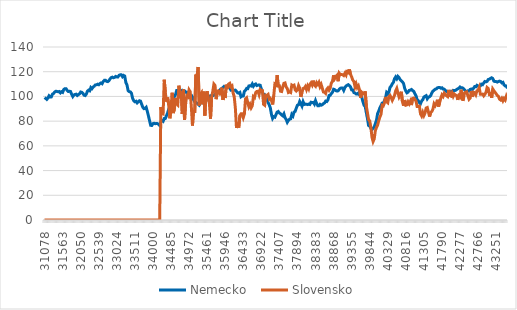
| Category | Nemecko  | Slovensko |
|---|---|---|
| 31078.0 | 99.1 | 0 |
| 31106.0 | 98.4 | 0 |
| 31137.0 | 97.6 | 0 |
| 31167.0 | 98.7 | 0 |
| 31198.0 | 100.5 | 0 |
| 31228.0 | 99.5 | 0 |
| 31259.0 | 99.6 | 0 |
| 31290.0 | 101.9 | 0 |
| 31320.0 | 102.4 | 0 |
| 31351.0 | 103.6 | 0 |
| 31381.0 | 104.2 | 0 |
| 31412.0 | 104 | 0 |
| 31443.0 | 103.8 | 0 |
| 31471.0 | 104 | 0 |
| 31502.0 | 102.9 | 0 |
| 31532.0 | 103.8 | 0 |
| 31563.0 | 103.3 | 0 |
| 31593.0 | 105.6 | 0 |
| 31624.0 | 106.3 | 0 |
| 31655.0 | 106.3 | 0 |
| 31685.0 | 104.9 | 0 |
| 31716.0 | 104 | 0 |
| 31746.0 | 104.2 | 0 |
| 31777.0 | 104 | 0 |
| 31808.0 | 101.7 | 0 |
| 31836.0 | 99.9 | 0 |
| 31867.0 | 101.2 | 0 |
| 31897.0 | 101.6 | 0 |
| 31928.0 | 101.8 | 0 |
| 31958.0 | 100.8 | 0 |
| 31989.0 | 101.5 | 0 |
| 32020.0 | 102.1 | 0 |
| 32050.0 | 103.6 | 0 |
| 32081.0 | 103.3 | 0 |
| 32111.0 | 102.5 | 0 |
| 32142.0 | 101 | 0 |
| 32173.0 | 100.7 | 0 |
| 32202.0 | 101.9 | 0 |
| 32233.0 | 104.3 | 0 |
| 32263.0 | 105.1 | 0 |
| 32294.0 | 104.6 | 0 |
| 32324.0 | 107.2 | 0 |
| 32355.0 | 106.3 | 0 |
| 32386.0 | 107.5 | 0 |
| 32416.0 | 108.3 | 0 |
| 32447.0 | 109.3 | 0 |
| 32477.0 | 109.4 | 0 |
| 32508.0 | 109.9 | 0 |
| 32539.0 | 109.5 | 0 |
| 32567.0 | 110.4 | 0 |
| 32598.0 | 110.9 | 0 |
| 32628.0 | 110.3 | 0 |
| 32659.0 | 112.1 | 0 |
| 32689.0 | 113.1 | 0 |
| 32720.0 | 113.1 | 0 |
| 32751.0 | 112.2 | 0 |
| 32781.0 | 112 | 0 |
| 32812.0 | 112.7 | 0 |
| 32842.0 | 114.2 | 0 |
| 32873.0 | 115.2 | 0 |
| 32904.0 | 115.6 | 0 |
| 32932.0 | 115.1 | 0 |
| 32963.0 | 115.4 | 0 |
| 32993.0 | 116.2 | 0 |
| 33024.0 | 115.8 | 0 |
| 33054.0 | 115.8 | 0 |
| 33085.0 | 117.1 | 0 |
| 33116.0 | 117.5 | 0 |
| 33146.0 | 117.5 | 0 |
| 33177.0 | 116 | 0 |
| 33207.0 | 117 | 0 |
| 33238.0 | 116.5 | 0 |
| 33269.0 | 111.3 | 0 |
| 33297.0 | 109.3 | 0 |
| 33328.0 | 104.7 | 0 |
| 33358.0 | 103.9 | 0 |
| 33389.0 | 103.7 | 0 |
| 33419.0 | 102.5 | 0 |
| 33450.0 | 98.4 | 0 |
| 33481.0 | 96.5 | 0 |
| 33511.0 | 95.7 | 0 |
| 33542.0 | 96.1 | 0 |
| 33572.0 | 94.8 | 0 |
| 33603.0 | 95.7 | 0 |
| 33634.0 | 96.5 | 0 |
| 33663.0 | 96.2 | 0 |
| 33694.0 | 93.7 | 0 |
| 33724.0 | 91.3 | 0 |
| 33755.0 | 90.1 | 0 |
| 33785.0 | 90.3 | 0 |
| 33816.0 | 91.2 | 0 |
| 33847.0 | 87.9 | 0 |
| 33877.0 | 84.3 | 0 |
| 33908.0 | 80.4 | 0 |
| 33938.0 | 76.6 | 0 |
| 33969.0 | 76.5 | 0 |
| 34000.0 | 78 | 0 |
| 34028.0 | 78.3 | 0 |
| 34059.0 | 77.9 | 0 |
| 34089.0 | 78.1 | 0 |
| 34120.0 | 78 | 0 |
| 34150.0 | 77.4 | 0 |
| 34181.0 | 76.4 | 0 |
| 34212.0 | 79.6 | 91.4 |
| 34242.0 | 80.4 | 86.1 |
| 34273.0 | 79.8 | 85.8 |
| 34303.0 | 82.1 | 113.5 |
| 34334.0 | 82.2 | 103.1 |
| 34365.0 | 84.5 | 95.8 |
| 34393.0 | 86.6 | 99.2 |
| 34424.0 | 89.8 | 92.9 |
| 34454.0 | 92.4 | 82.3 |
| 34485.0 | 94.6 | 90 |
| 34515.0 | 96.2 | 103 |
| 34546.0 | 97.9 | 86.5 |
| 34577.0 | 99.8 | 89.8 |
| 34607.0 | 101.4 | 98.8 |
| 34638.0 | 104.8 | 94 |
| 34668.0 | 104.9 | 93.1 |
| 34699.0 | 104.3 | 108.7 |
| 34730.0 | 104.9 | 102.1 |
| 34758.0 | 104.3 | 104 |
| 34789.0 | 105 | 85.8 |
| 34819.0 | 104.6 | 105.6 |
| 34850.0 | 104.5 | 81 |
| 34880.0 | 103.4 | 94.9 |
| 34911.0 | 103.5 | 100.4 |
| 34942.0 | 102.3 | 99.6 |
| 34972.0 | 101.1 | 105.3 |
| 35003.0 | 101.1 | 103.8 |
| 35033.0 | 101 | 91.6 |
| 35064.0 | 99.5 | 76.4 |
| 35095.0 | 97.3 | 89.1 |
| 35124.0 | 95.7 | 86.6 |
| 35155.0 | 95.2 | 117.8 |
| 35185.0 | 94.5 | 116 |
| 35216.0 | 93.8 | 123.8 |
| 35246.0 | 92.9 | 92.7 |
| 35277.0 | 94.4 | 101.6 |
| 35308.0 | 95 | 103 |
| 35338.0 | 95.9 | 93.7 |
| 35369.0 | 96.4 | 103.9 |
| 35399.0 | 96.4 | 84.5 |
| 35430.0 | 96.6 | 101.3 |
| 35461.0 | 98.8 | 104.2 |
| 35489.0 | 98.7 | 98.4 |
| 35520.0 | 99.5 | 94.2 |
| 35550.0 | 100.6 | 82 |
| 35581.0 | 100.6 | 99.6 |
| 35611.0 | 100.6 | 104 |
| 35642.0 | 101 | 110 |
| 35673.0 | 101.5 | 108.9 |
| 35703.0 | 102.7 | 97.8 |
| 35734.0 | 103.2 | 103.1 |
| 35764.0 | 103.3 | 104.5 |
| 35795.0 | 104.8 | 103.8 |
| 35826.0 | 105.9 | 100.9 |
| 35854.0 | 106.1 | 107 |
| 35885.0 | 107.3 | 97.2 |
| 35915.0 | 108.1 | 101.2 |
| 35946.0 | 107.6 | 98.7 |
| 35976.0 | 107.9 | 109.5 |
| 36007.0 | 108.6 | 106.1 |
| 36038.0 | 107.8 | 110 |
| 36068.0 | 107 | 110.6 |
| 36099.0 | 105.1 | 107.9 |
| 36129.0 | 105.2 | 108.6 |
| 36160.0 | 104.8 | 102.9 |
| 36191.0 | 105 | 99.7 |
| 36219.0 | 105.1 | 90.6 |
| 36250.0 | 104.1 | 74.5 |
| 36280.0 | 102.9 | 78.8 |
| 36311.0 | 102.6 | 74.8 |
| 36341.0 | 103.2 | 84.5 |
| 36372.0 | 99.7 | 85.9 |
| 36403.0 | 100.3 | 85.9 |
| 36433.0 | 100.3 | 82.9 |
| 36464.0 | 104.1 | 85.8 |
| 36494.0 | 105 | 97.9 |
| 36525.0 | 106.5 | 98.8 |
| 36556.0 | 106.3 | 95.1 |
| 36585.0 | 108.5 | 91.6 |
| 36616.0 | 108.7 | 93.5 |
| 36646.0 | 108.4 | 90.8 |
| 36677.0 | 110.1 | 92.5 |
| 36707.0 | 108.3 | 99.9 |
| 36738.0 | 109.6 | 99.1 |
| 36769.0 | 110.1 | 103.1 |
| 36799.0 | 108.8 | 104 |
| 36830.0 | 109.1 | 104.2 |
| 36860.0 | 109.3 | 101.5 |
| 36891.0 | 109 | 105.6 |
| 36922.0 | 106.2 | 104.9 |
| 36950.0 | 103.7 | 104.7 |
| 36981.0 | 100.6 | 93.6 |
| 37011.0 | 101.3 | 92.9 |
| 37042.0 | 100 | 101 |
| 37072.0 | 97.5 | 100.8 |
| 37103.0 | 95.1 | 101.6 |
| 37134.0 | 93.2 | 97.7 |
| 37164.0 | 90.7 | 98.4 |
| 37195.0 | 85.3 | 96.7 |
| 37225.0 | 82.2 | 93.5 |
| 37256.0 | 83.6 | 100.6 |
| 37287.0 | 83.2 | 109.9 |
| 37315.0 | 85.3 | 109.2 |
| 37346.0 | 87.3 | 117.3 |
| 37376.0 | 87.8 | 108.5 |
| 37407.0 | 86.6 | 108.6 |
| 37437.0 | 86 | 104.2 |
| 37468.0 | 85 | 104 |
| 37499.0 | 84.3 | 107.7 |
| 37529.0 | 85.9 | 110.6 |
| 37560.0 | 82.8 | 110.9 |
| 37590.0 | 81.4 | 107.6 |
| 37621.0 | 79.1 | 106.4 |
| 37652.0 | 80.6 | 103.2 |
| 37680.0 | 81.6 | 103.7 |
| 37711.0 | 81.9 | 103.2 |
| 37741.0 | 85.4 | 109.2 |
| 37772.0 | 84.2 | 108.6 |
| 37802.0 | 87.4 | 109.1 |
| 37833.0 | 87.9 | 105.3 |
| 37864.0 | 90.6 | 104.4 |
| 37894.0 | 92.9 | 105.4 |
| 37925.0 | 93.3 | 108.8 |
| 37955.0 | 95.9 | 106.8 |
| 37986.0 | 94.1 | 99.6 |
| 38017.0 | 92.2 | 103.3 |
| 38046.0 | 95.7 | 106.4 |
| 38077.0 | 93.5 | 106.6 |
| 38107.0 | 93.8 | 108 |
| 38138.0 | 93.7 | 105.6 |
| 38168.0 | 93.4 | 108.4 |
| 38199.0 | 93.8 | 106.3 |
| 38230.0 | 93.5 | 109.8 |
| 38260.0 | 95.3 | 111 |
| 38291.0 | 95.1 | 109.3 |
| 38321.0 | 95.2 | 112.8 |
| 38352.0 | 93.8 | 109.1 |
| 38383.0 | 96.6 | 108.2 |
| 38411.0 | 94.2 | 111.1 |
| 38442.0 | 92.5 | 109.8 |
| 38472.0 | 92.5 | 111.4 |
| 38503.0 | 93.6 | 107.9 |
| 38533.0 | 92.9 | 109.7 |
| 38564.0 | 93.3 | 106.7 |
| 38595.0 | 94.2 | 103.6 |
| 38625.0 | 94.7 | 103.4 |
| 38656.0 | 96.2 | 102.5 |
| 38686.0 | 95.9 | 105.8 |
| 38717.0 | 97.2 | 106.9 |
| 38748.0 | 100.7 | 105.1 |
| 38776.0 | 100.9 | 106.7 |
| 38807.0 | 102.3 | 110.8 |
| 38837.0 | 103.3 | 112.1 |
| 38868.0 | 105.8 | 117.1 |
| 38898.0 | 105.5 | 114.5 |
| 38929.0 | 104.7 | 116.3 |
| 38960.0 | 104.4 | 117.2 |
| 38990.0 | 104.5 | 112.3 |
| 39021.0 | 105.7 | 118.8 |
| 39051.0 | 106.6 | 117.6 |
| 39082.0 | 106.9 | 117.7 |
| 39113.0 | 106.8 | 117.6 |
| 39141.0 | 104.9 | 116.9 |
| 39172.0 | 107.1 | 118.7 |
| 39202.0 | 108.4 | 117.3 |
| 39233.0 | 109 | 121.5 |
| 39263.0 | 109.5 | 118 |
| 39294.0 | 108.8 | 121.8 |
| 39325.0 | 107.7 | 118 |
| 39355.0 | 105.3 | 115.8 |
| 39386.0 | 105.2 | 113.2 |
| 39416.0 | 103.1 | 112.2 |
| 39447.0 | 102.8 | 107.7 |
| 39478.0 | 102 | 110.1 |
| 39507.0 | 102 | 107.1 |
| 39538.0 | 102.8 | 108.5 |
| 39568.0 | 101.1 | 105.2 |
| 39599.0 | 100.8 | 98.9 |
| 39629.0 | 99.3 | 103.3 |
| 39660.0 | 95.7 | 102.4 |
| 39691.0 | 92.9 | 101.9 |
| 39721.0 | 91.9 | 104.1 |
| 39752.0 | 87 | 92.2 |
| 39782.0 | 82.1 | 86.7 |
| 39813.0 | 76.5 | 81.3 |
| 39844.0 | 76.1 | 80.2 |
| 39872.0 | 74.2 | 75.2 |
| 39903.0 | 73.1 | 67.1 |
| 39933.0 | 74.3 | 63.5 |
| 39964.0 | 75.3 | 65.6 |
| 39994.0 | 78.1 | 72.3 |
| 40025.0 | 80.8 | 74.9 |
| 40056.0 | 86.1 | 76.8 |
| 40086.0 | 88.2 | 80.3 |
| 40117.0 | 90.8 | 83.4 |
| 40147.0 | 92.6 | 85.4 |
| 40178.0 | 94.5 | 92.8 |
| 40209.0 | 94.5 | 92.3 |
| 40237.0 | 96.4 | 94.5 |
| 40268.0 | 98.8 | 99.6 |
| 40298.0 | 103.2 | 95.7 |
| 40329.0 | 102.2 | 94.9 |
| 40359.0 | 103.5 | 99.9 |
| 40390.0 | 107.3 | 100.8 |
| 40421.0 | 108.4 | 99 |
| 40451.0 | 110.2 | 96.8 |
| 40482.0 | 111.4 | 98.7 |
| 40512.0 | 114.4 | 100.9 |
| 40543.0 | 115.8 | 104.6 |
| 40574.0 | 114.3 | 106.5 |
| 40602.0 | 116.2 | 102.9 |
| 40633.0 | 115.2 | 99.6 |
| 40663.0 | 113.6 | 101.5 |
| 40694.0 | 112.7 | 103.8 |
| 40724.0 | 111.8 | 95.7 |
| 40755.0 | 110.4 | 92.5 |
| 40786.0 | 106.5 | 97.1 |
| 40816.0 | 104.4 | 92.9 |
| 40847.0 | 102.9 | 93.2 |
| 40877.0 | 103.5 | 95.6 |
| 40908.0 | 104.9 | 94 |
| 40939.0 | 105.1 | 96.1 |
| 40968.0 | 105.6 | 93 |
| 40999.0 | 104.8 | 98.4 |
| 41029.0 | 104.1 | 98.7 |
| 41060.0 | 102.2 | 97.7 |
| 41090.0 | 100.6 | 96.2 |
| 41121.0 | 97.4 | 91.9 |
| 41152.0 | 96.6 | 91.9 |
| 41182.0 | 95 | 92.1 |
| 41213.0 | 94.1 | 85.9 |
| 41243.0 | 96.3 | 84.2 |
| 41274.0 | 97.3 | 87 |
| 41305.0 | 99.5 | 84.5 |
| 41333.0 | 100.1 | 86.5 |
| 41364.0 | 100.6 | 90.6 |
| 41394.0 | 98.1 | 91 |
| 41425.0 | 99.4 | 87.4 |
| 41455.0 | 99.8 | 83.7 |
| 41486.0 | 100.6 | 87 |
| 41517.0 | 102.8 | 87.8 |
| 41547.0 | 104.3 | 89.7 |
| 41578.0 | 105 | 94 |
| 41608.0 | 105.8 | 92.5 |
| 41639.0 | 106.1 | 94.3 |
| 41670.0 | 107 | 97.3 |
| 41698.0 | 107.2 | 91.8 |
| 41729.0 | 107.3 | 95.2 |
| 41759.0 | 106.7 | 98.6 |
| 41790.0 | 107 | 101.2 |
| 41820.0 | 106 | 100 |
| 41851.0 | 105.9 | 102.6 |
| 41882.0 | 104.9 | 101.5 |
| 41912.0 | 104 | 100.6 |
| 41943.0 | 104.2 | 99.9 |
| 41973.0 | 103.4 | 105.3 |
| 42004.0 | 103.5 | 100.6 |
| 42035.0 | 104.1 | 100.2 |
| 42063.0 | 103.6 | 102.7 |
| 42094.0 | 104.9 | 100 |
| 42124.0 | 104.8 | 101.9 |
| 42155.0 | 104.9 | 101.1 |
| 42185.0 | 105.6 | 100.7 |
| 42216.0 | 106.2 | 97.2 |
| 42247.0 | 106.6 | 100.7 |
| 42277.0 | 107.6 | 99.8 |
| 42308.0 | 106.9 | 105.4 |
| 42338.0 | 107 | 97.6 |
| 42369.0 | 106.4 | 97.5 |
| 42400.0 | 105.4 | 102.9 |
| 42429.0 | 104.2 | 103.6 |
| 42460.0 | 103.8 | 103.7 |
| 42490.0 | 104.5 | 100.3 |
| 42521.0 | 104.4 | 97.7 |
| 42551.0 | 105.7 | 98.7 |
| 42582.0 | 106 | 104.4 |
| 42613.0 | 105.6 | 99.7 |
| 42643.0 | 106.6 | 103.4 |
| 42674.0 | 108 | 103.1 |
| 42704.0 | 107.8 | 101.4 |
| 42735.0 | 109 | 104.6 |
| 42766.0 | 108.4 | 104.8 |
| 42794.0 | 108 | 107.2 |
| 42825.0 | 108.5 | 101.8 |
| 42855.0 | 109.9 | 101.7 |
| 42886.0 | 109.5 | 101.9 |
| 42916.0 | 110.9 | 100.5 |
| 42947.0 | 112.1 | 101.7 |
| 42978.0 | 111.8 | 103.3 |
| 43008.0 | 112.2 | 107.2 |
| 43039.0 | 113.7 | 106.4 |
| 43069.0 | 114 | 101.8 |
| 43100.0 | 114.6 | 102.3 |
| 43131.0 | 115.1 | 98.9 |
| 43159.0 | 114.5 | 106 |
| 43190.0 | 112.4 | 104.6 |
| 43220.0 | 112 | 103.4 |
| 43251.0 | 112 | 102.1 |
| 43281.0 | 111.6 | 100.8 |
| 43312.0 | 112.1 | 100.1 |
| 43343.0 | 112.4 | 97.8 |
| 43373.0 | 112.1 | 97.1 |
| 43404.0 | 111 | 98.5 |
| 43434.0 | 111.4 | 96.5 |
| 43465.0 | 109.3 | 98.3 |
| 43496.0 | 108.5 | 97.1 |
| 43524.0 | 108.4 | 100.1 |
| 43555.0 | 106.6 | 97.7 |